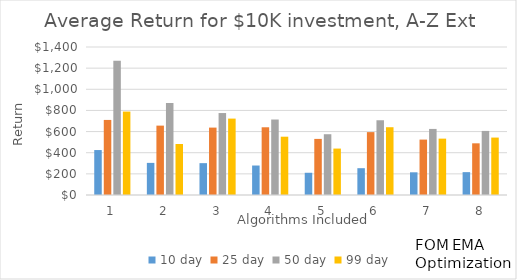
| Category | 10 day | 25 day | 50 day | 99 day |
|---|---|---|---|---|
| 1.0 | 425.219 | 710.102 | 1268.785 | 789.2 |
| 2.0 | 303.79 | 656.274 | 870.579 | 482.191 |
| 3.0 | 301.308 | 637.555 | 775.264 | 722.68 |
| 4.0 | 278.852 | 640.621 | 713.997 | 551.509 |
| 5.0 | 210.323 | 530.687 | 574.938 | 439.191 |
| 6.0 | 253.565 | 594.771 | 707.022 | 641.155 |
| 7.0 | 214.679 | 524.098 | 625.037 | 533.121 |
| 8.0 | 216.242 | 488.869 | 606.119 | 543.201 |